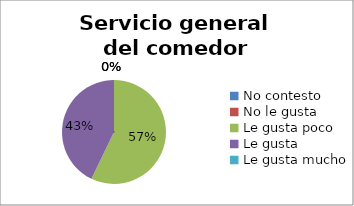
| Category | Series 0 |
|---|---|
| No contesto | 0 |
| No le gusta | 0 |
| Le gusta poco | 4 |
| Le gusta | 3 |
| Le gusta mucho | 0 |